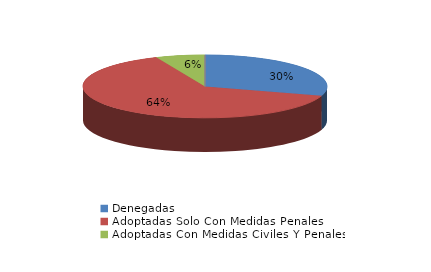
| Category | Series 0 |
|---|---|
| Denegadas | 46 |
| Adoptadas Solo Con Medidas Penales | 98 |
| Adoptadas Con Medidas Civiles Y Penales | 10 |
| Adoptadas Con Medidas Solo Civiles | 0 |